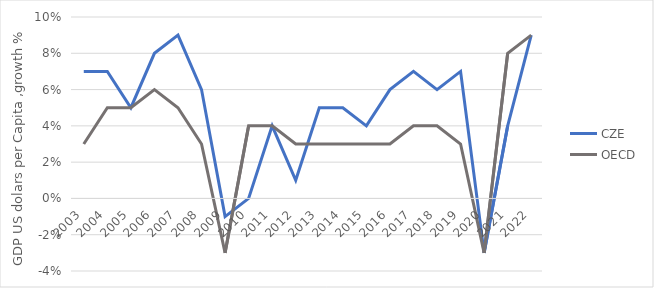
| Category | CZE | OECD |
|---|---|---|
| 2003.0 | 0.07 | 0.03 |
| 2004.0 | 0.07 | 0.05 |
| 2005.0 | 0.05 | 0.05 |
| 2006.0 | 0.08 | 0.06 |
| 2007.0 | 0.09 | 0.05 |
| 2008.0 | 0.06 | 0.03 |
| 2009.0 | -0.01 | -0.03 |
| 2010.0 | 0 | 0.04 |
| 2011.0 | 0.04 | 0.04 |
| 2012.0 | 0.01 | 0.03 |
| 2013.0 | 0.05 | 0.03 |
| 2014.0 | 0.05 | 0.03 |
| 2015.0 | 0.04 | 0.03 |
| 2016.0 | 0.06 | 0.03 |
| 2017.0 | 0.07 | 0.04 |
| 2018.0 | 0.06 | 0.04 |
| 2019.0 | 0.07 | 0.03 |
| 2020.0 | -0.03 | -0.03 |
| 2021.0 | 0.04 | 0.08 |
| 2022.0 | 0.09 | 0.09 |